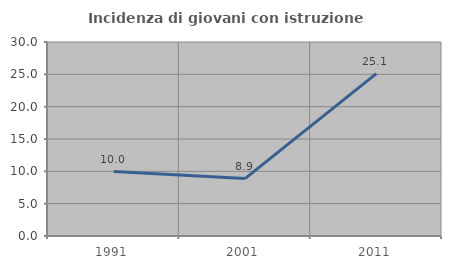
| Category | Incidenza di giovani con istruzione universitaria |
|---|---|
| 1991.0 | 9.968 |
| 2001.0 | 8.874 |
| 2011.0 | 25.11 |